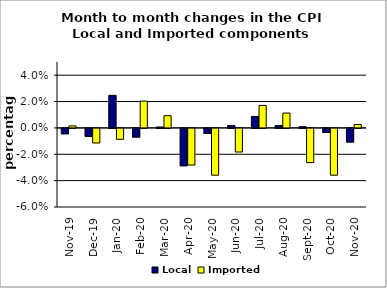
| Category | Local | Imported |
|---|---|---|
| 2019-11-01 | -0.004 | 0.002 |
| 2019-12-01 | -0.006 | -0.011 |
| 2020-01-01 | 0.025 | -0.008 |
| 2020-02-01 | -0.007 | 0.02 |
| 2020-03-01 | 0.001 | 0.009 |
| 2020-04-01 | -0.028 | -0.028 |
| 2020-05-01 | -0.004 | -0.035 |
| 2020-06-01 | 0.002 | -0.018 |
| 2020-07-01 | 0.009 | 0.017 |
| 2020-08-01 | 0.002 | 0.011 |
| 2020-09-01 | 0.001 | -0.026 |
| 2020-10-01 | -0.003 | -0.035 |
| 2020-11-01 | -0.01 | 0.003 |